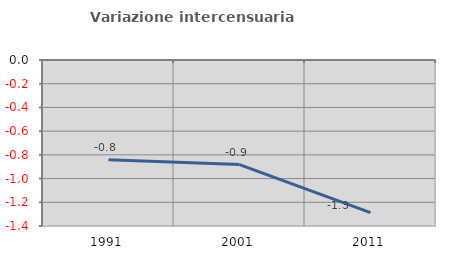
| Category | Variazione intercensuaria annua |
|---|---|
| 1991.0 | -0.841 |
| 2001.0 | -0.882 |
| 2011.0 | -1.287 |